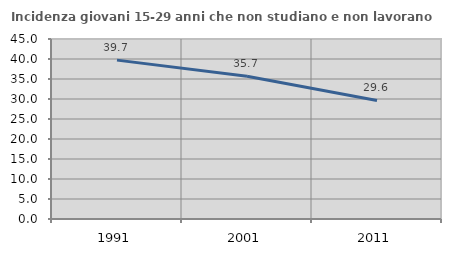
| Category | Incidenza giovani 15-29 anni che non studiano e non lavorano  |
|---|---|
| 1991.0 | 39.72 |
| 2001.0 | 35.684 |
| 2011.0 | 29.63 |